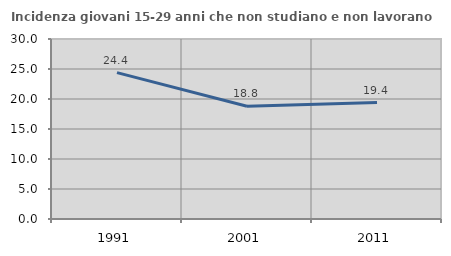
| Category | Incidenza giovani 15-29 anni che non studiano e non lavorano  |
|---|---|
| 1991.0 | 24.39 |
| 2001.0 | 18.797 |
| 2011.0 | 19.401 |